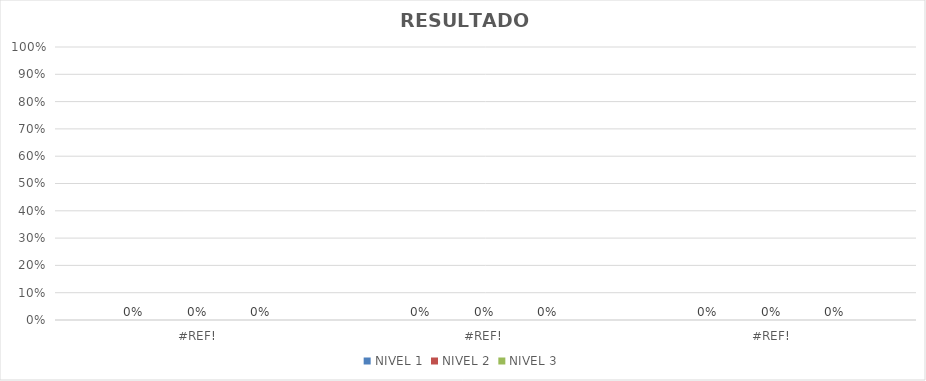
| Category | NIVEL 1 | NIVEL 2 | NIVEL 3 |
|---|---|---|---|
| 0.0 | 0 | 0 | 0 |
| 0.0 | 0 | 0 | 0 |
| 0.0 | 0 | 0 | 0 |